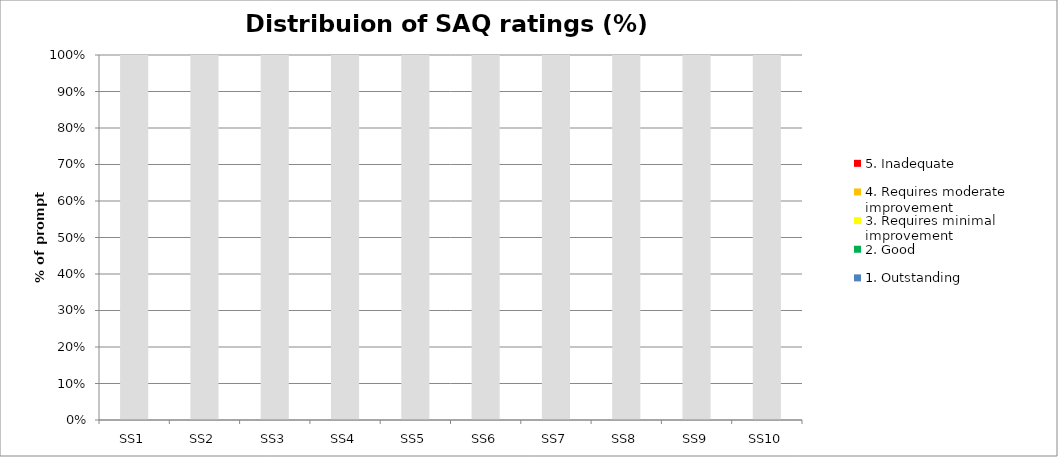
| Category | Not applicable | 1. Outstanding | 2. Good | 3. Requires minimal improvement | 4. Requires moderate improvement | 5. Inadequate |
|---|---|---|---|---|---|---|
| SS1 | 1 | 0 | 0 | 0 | 0 | 0 |
| SS2 | 1 | 0 | 0 | 0 | 0 | 0 |
| SS3 | 1 | 0 | 0 | 0 | 0 | 0 |
| SS4 | 1 | 0 | 0 | 0 | 0 | 0 |
| SS5 | 1 | 0 | 0 | 0 | 0 | 0 |
| SS6 | 1 | 0 | 0 | 0 | 0 | 0 |
| SS7 | 1 | 0 | 0 | 0 | 0 | 0 |
| SS8 | 1 | 0 | 0 | 0 | 0 | 0 |
| SS9 | 1 | 0 | 0 | 0 | 0 | 0 |
| SS10 | 1 | 0 | 0 | 0 | 0 | 0 |